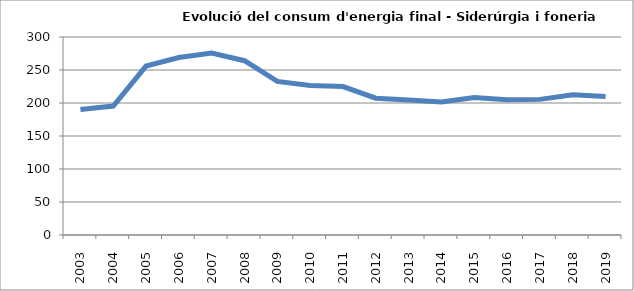
| Category | 190,3 |
|---|---|
| 2003.0 | 190.29 |
| 2004.0 | 195.45 |
| 2005.0 | 255.94 |
| 2006.0 | 268.89 |
| 2007.0 | 275.8 |
| 2008.0 | 264.1 |
| 2009.0 | 232.67 |
| 2010.0 | 226.58 |
| 2011.0 | 224.92 |
| 2012.0 | 207.34 |
| 2013.0 | 204.5 |
| 2014.0 | 201.61 |
| 2015.0 | 208.48 |
| 2016.0 | 204.86 |
| 2017.0 | 205.49 |
| 2018.0 | 212.65 |
| 2019.0 | 209.81 |